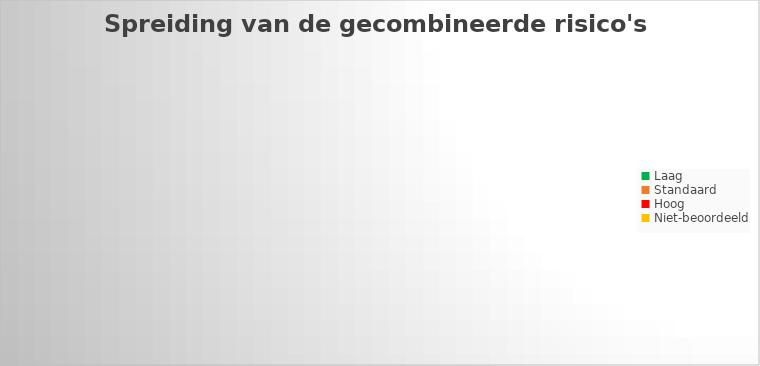
| Category | Series 0 |
|---|---|
| Laag | 0 |
| Standaard | 0 |
| Hoog | 0 |
| Niet-beoordeeld | 0 |